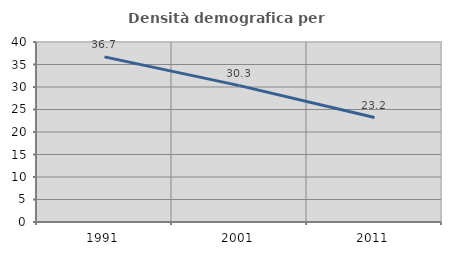
| Category | Densità demografica |
|---|---|
| 1991.0 | 36.694 |
| 2001.0 | 30.299 |
| 2011.0 | 23.221 |